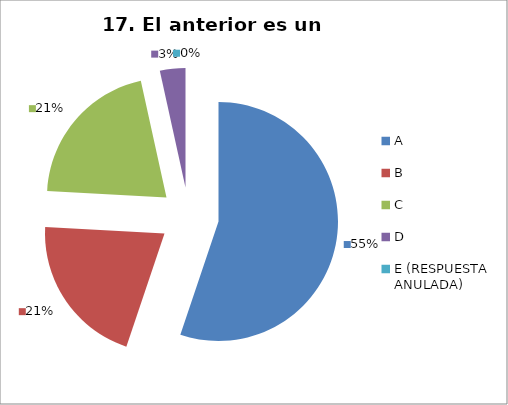
| Category | CANTIDAD DE RESPUESTAS PREGUNTA (17) | PORCENTAJE |
|---|---|---|
| A | 16 | 0.552 |
| B | 6 | 0.207 |
| C | 6 | 0.207 |
| D | 1 | 0.034 |
| E (RESPUESTA ANULADA) | 0 | 0 |